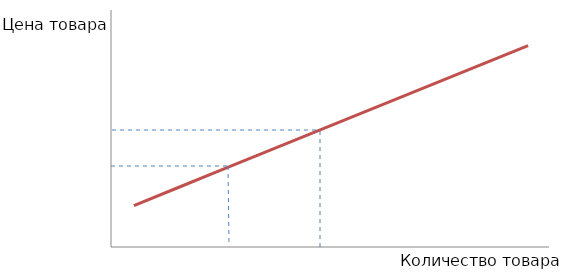
| Category | Цена товара |
|---|---|
| 1.0 | 70 |
| 2.0 | 100 |
| 3.0 | 130 |
| 4.0 | 160 |
| 5.0 | 190 |
| 6.0 | 220 |
| 7.0 | 250 |
| 8.0 | 280 |
| 9.0 | 310 |
| 10.0 | 340 |